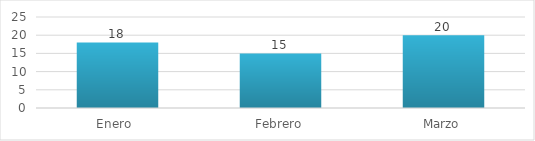
| Category | Series 0 |
|---|---|
| Enero  | 18 |
| Febrero | 15 |
| Marzo | 20 |